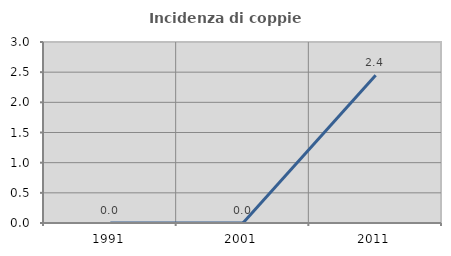
| Category | Incidenza di coppie miste |
|---|---|
| 1991.0 | 0 |
| 2001.0 | 0 |
| 2011.0 | 2.45 |